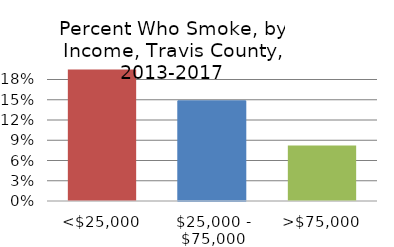
| Category | Series 0 |
|---|---|
| <$25,000 | 0.195 |
| $25,000 - $75,000 | 0.148 |
| >$75,000 | 0.082 |